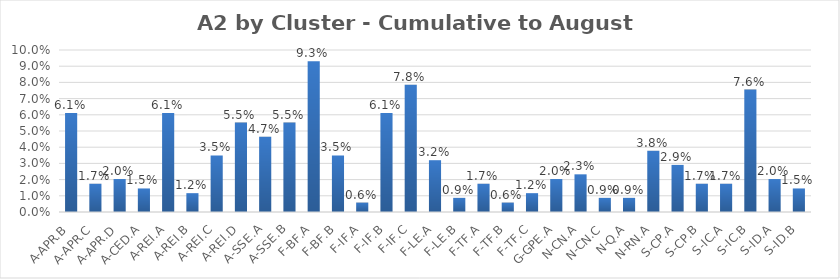
| Category | Series 0 |
|---|---|
| A-APR.B | 0.061 |
| A-APR.C | 0.017 |
| A-APR.D | 0.02 |
| A-CED.A | 0.015 |
| A-REI.A | 0.061 |
| A-REI.B | 0.012 |
| A-REI.C | 0.035 |
| A-REI.D | 0.055 |
| A-SSE.A | 0.047 |
| A-SSE.B | 0.055 |
| F-BF.A | 0.093 |
| F-BF.B | 0.035 |
| F-IF.A | 0.006 |
| F-IF.B | 0.061 |
| F-IF.C | 0.078 |
| F-LE.A | 0.032 |
| F-LE.B | 0.009 |
| F-TF.A | 0.017 |
| F-TF.B | 0.006 |
| F-TF.C | 0.012 |
| G-GPE.A | 0.02 |
| N-CN.A | 0.023 |
| N-CN.C | 0.009 |
| N-Q.A | 0.009 |
| N-RN.A | 0.038 |
| S-CP.A | 0.029 |
| S-CP.B | 0.017 |
| S-IC.A | 0.017 |
| S-IC.B | 0.076 |
| S-ID.A | 0.02 |
| S-ID.B | 0.015 |